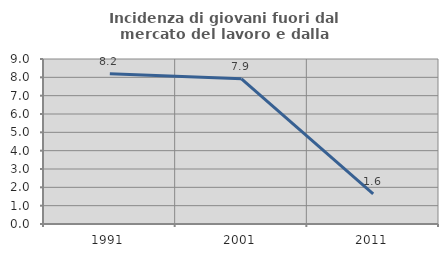
| Category | Incidenza di giovani fuori dal mercato del lavoro e dalla formazione  |
|---|---|
| 1991.0 | 8.197 |
| 2001.0 | 7.921 |
| 2011.0 | 1.639 |